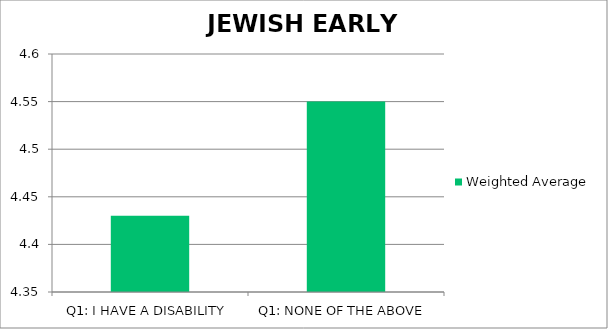
| Category | Weighted Average |
|---|---|
| Q1: I HAVE A DISABILITY | 4.43 |
| Q1: NONE OF THE ABOVE | 4.55 |